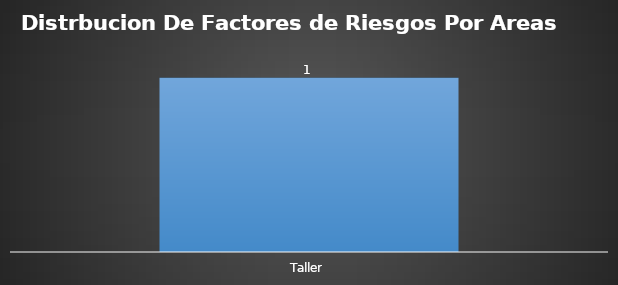
| Category | ELÉCTRICO  |
|---|---|
| Taller | 1 |